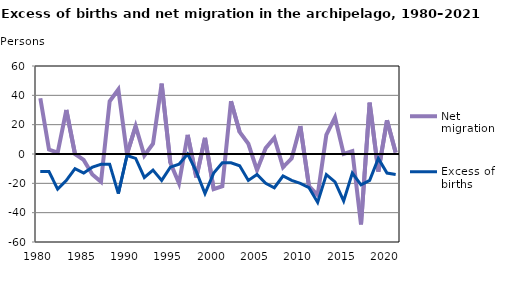
| Category | Net migration | Excess of births |
|---|---|---|
| 1980.0 | 38 | -12 |
| 1981.0 | 3 | -12 |
| 1982.0 | 1 | -24 |
| 1983.0 | 30 | -18 |
| 1984.0 | 0 | -10 |
| 1985.0 | -4 | -13 |
| 1986.0 | -14 | -9 |
| 1987.0 | -19 | -7 |
| 1988.0 | 36 | -7 |
| 1989.0 | 44 | -27 |
| 1990.0 | 0 | -1 |
| 1991.0 | 19 | -3 |
| 1992.0 | -1 | -16 |
| 1993.0 | 7 | -11 |
| 1994.0 | 48 | -18 |
| 1995.0 | -6 | -9 |
| 1996.0 | -20 | -7 |
| 1997.0 | 13 | 0 |
| 1998.0 | -16 | -12 |
| 1999.0 | 11 | -27 |
| 2000.0 | -24 | -13 |
| 2001.0 | -22 | -6 |
| 2002.0 | 36 | -6 |
| 2003.0 | 15 | -8 |
| 2004.0 | 7 | -18 |
| 2005.0 | -11 | -14 |
| 2006.0 | 4 | -20 |
| 2007.0 | 11 | -23 |
| 2008.0 | -9 | -15 |
| 2009.0 | -3 | -18 |
| 2010.0 | 19 | -20 |
| 2011.0 | -22 | -23 |
| 2012.0 | -28 | -33 |
| 2013.0 | 13 | -14 |
| 2014.0 | 25 | -19 |
| 2015.0 | 0 | -32 |
| 2016.0 | 2 | -13 |
| 2017.0 | -48 | -21 |
| 2018.0 | 35 | -18 |
| 2019.0 | -12 | -3 |
| 2020.0 | 23 | -13 |
| 2021.0 | 1 | -14 |